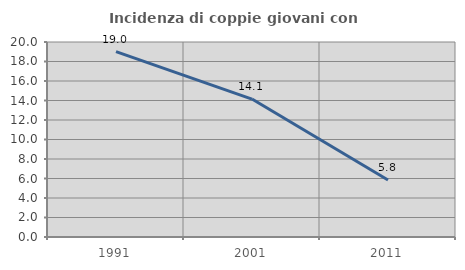
| Category | Incidenza di coppie giovani con figli |
|---|---|
| 1991.0 | 19.005 |
| 2001.0 | 14.149 |
| 2011.0 | 5.85 |